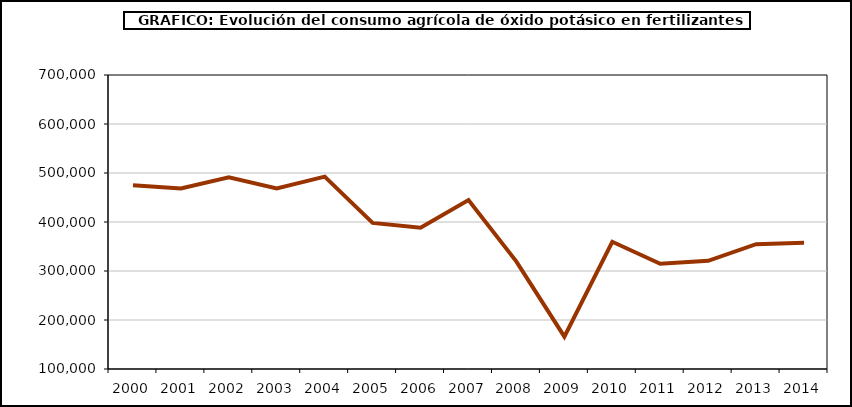
| Category | fertilizantes |
|---|---|
| 2000.0 | 474822 |
| 2001.0 | 468360 |
| 2002.0 | 491138 |
| 2003.0 | 468511 |
| 2004.0 | 492571 |
| 2005.0 | 398230 |
| 2006.0 | 388187 |
| 2007.0 | 444853 |
| 2008.0 | 319194 |
| 2009.0 | 166016 |
| 2010.0 | 359583 |
| 2011.0 | 314642 |
| 2012.0 | 320841 |
| 2013.0 | 354738 |
| 2014.0 | 357875 |